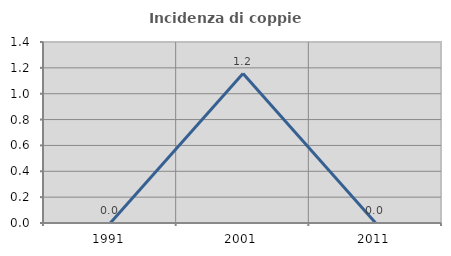
| Category | Incidenza di coppie miste |
|---|---|
| 1991.0 | 0 |
| 2001.0 | 1.156 |
| 2011.0 | 0 |